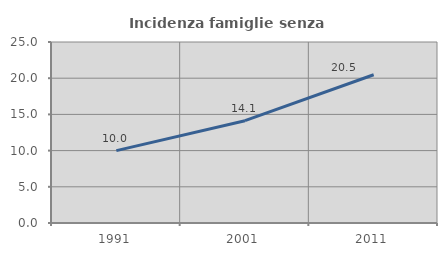
| Category | Incidenza famiglie senza nuclei |
|---|---|
| 1991.0 | 9.996 |
| 2001.0 | 14.132 |
| 2011.0 | 20.476 |